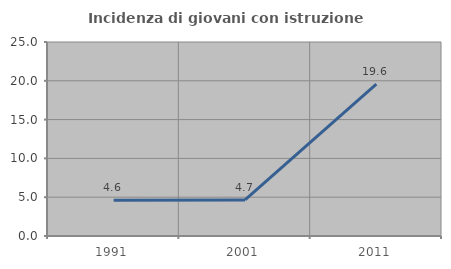
| Category | Incidenza di giovani con istruzione universitaria |
|---|---|
| 1991.0 | 4.615 |
| 2001.0 | 4.651 |
| 2011.0 | 19.565 |